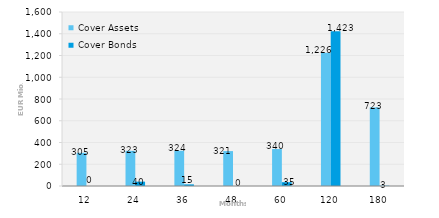
| Category | Cover Assets | Cover Bonds |
|---|---|---|
| 12.0 | 305.44 | 0 |
| 24.0 | 323.447 | 40 |
| 36.0 | 324.291 | 15 |
| 48.0 | 320.989 | 0 |
| 60.0 | 339.944 | 35 |
| 120.0 | 1226.052 | 1423.032 |
| 180.0 | 722.644 | 3 |